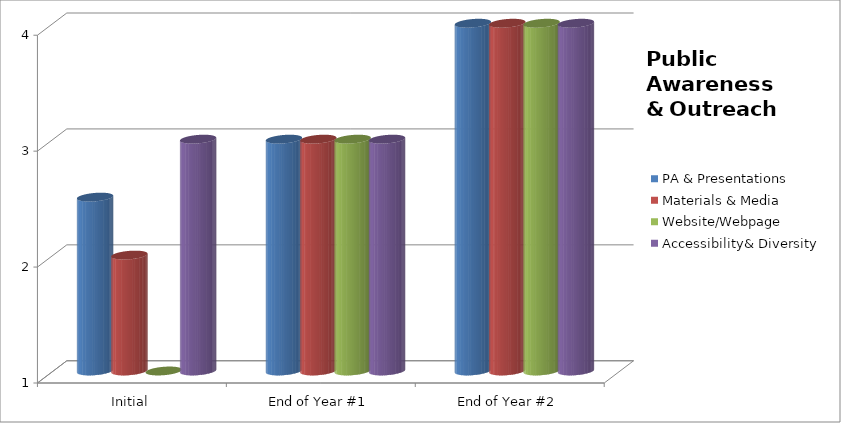
| Category | PA & Presentations  | Materials & Media  | Website/Webpage  | Accessibility& Diversity  |
|---|---|---|---|---|
| Initial | 2.5 | 2 | 1 | 3 |
| End of Year #1 | 3 | 3 | 3 | 3 |
| End of Year #2 | 4 | 4 | 4 | 4 |